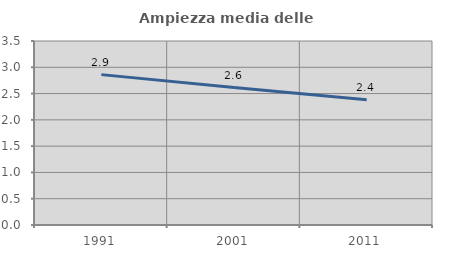
| Category | Ampiezza media delle famiglie |
|---|---|
| 1991.0 | 2.86 |
| 2001.0 | 2.614 |
| 2011.0 | 2.382 |